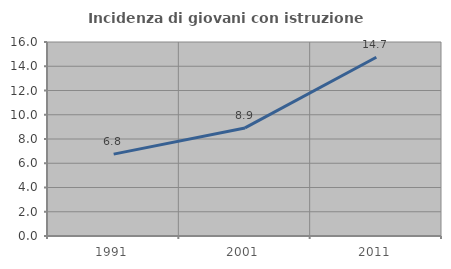
| Category | Incidenza di giovani con istruzione universitaria |
|---|---|
| 1991.0 | 6.751 |
| 2001.0 | 8.914 |
| 2011.0 | 14.744 |